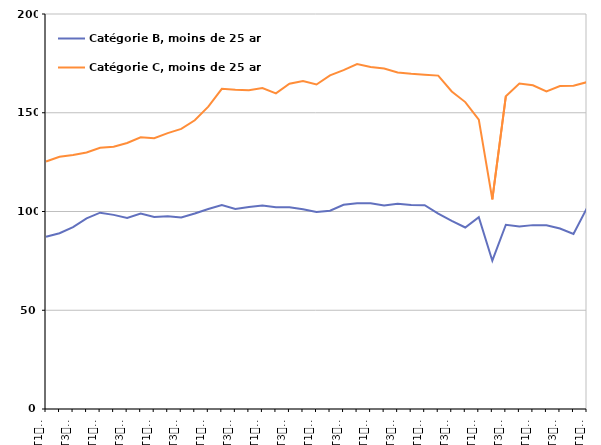
| Category | Catégorie B, moins de 25 ans | Catégorie C, moins de 25 ans |
|---|---|---|
| T1
2012 | 87.2 | 125.3 |
| T2
2012 | 89 | 127.7 |
| T3
2012 | 92.1 | 128.6 |
| T4
2012 | 96.5 | 129.9 |
| T1
2013 | 99.4 | 132.3 |
| T2
2013 | 98.3 | 132.8 |
| T3
2013 | 96.7 | 134.7 |
| T4
2013 | 99 | 137.6 |
| T1
2014 | 97.2 | 137.1 |
| T2
2014 | 97.6 | 139.7 |
| T3
2014 | 97 | 141.8 |
| T4
2014 | 99 | 146.2 |
| T1
2015 | 101.3 | 153.1 |
| T2
2015 | 103.3 | 162.1 |
| T3
2015 | 101.3 | 161.6 |
| T4
2015 | 102.3 | 161.4 |
| T1
2016 | 103 | 162.5 |
| T2
2016 | 102.1 | 159.8 |
| T3
2016 | 102.2 | 164.7 |
| T4
2016 | 101.1 | 166.1 |
| T1
2017 | 99.7 | 164.3 |
| T2
2017 | 100.4 | 168.9 |
| T3
2017 | 103.4 | 171.6 |
| T4
2017 | 104.2 | 174.7 |
| T1
2018 | 104.2 | 173.2 |
| T2
2018 | 103 | 172.4 |
| T3
2018 | 103.9 | 170.4 |
| T4
2018 | 103.3 | 169.7 |
| T1
2019 | 103.2 | 169.3 |
| T2
2019 | 98.9 | 168.8 |
| T3
2019 | 95.3 | 160.8 |
| T4
2019 | 91.9 | 155.4 |
| T1
2020 | 97.1 | 146.5 |
| T2
2020 | 75.1 | 106.1 |
| T3
2020 | 93.3 | 158.4 |
| T4
2020 | 92.4 | 164.8 |
| T1
2021 | 93.1 | 163.9 |
| T2
2021 | 93 | 160.8 |
| T3
2021 | 91.4 | 163.5 |
| T4
2021 | 88.6 | 163.7 |
| T1
2022 | 101.8 | 165.5 |